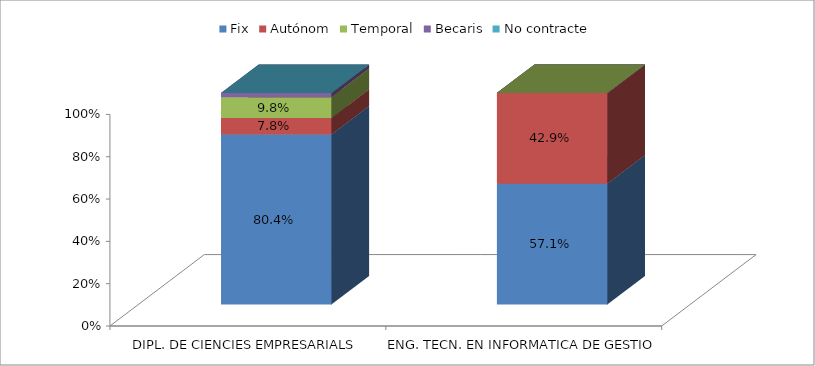
| Category | Fix | Autónom | Temporal | Becaris | No contracte |
|---|---|---|---|---|---|
| DIPL. DE CIENCIES EMPRESARIALS | 0.804 | 0.078 | 0.098 | 0.02 | 0 |
| ENG. TECN. EN INFORMATICA DE GESTIO | 0.571 | 0.429 | 0 | 0 | 0 |